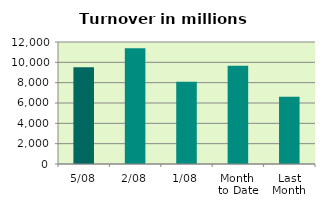
| Category | Series 0 |
|---|---|
| 5/08 | 9525.169 |
| 2/08 | 11386.037 |
| 1/08 | 8100.455 |
| Month 
to Date | 9670.554 |
| Last
Month | 6625.077 |